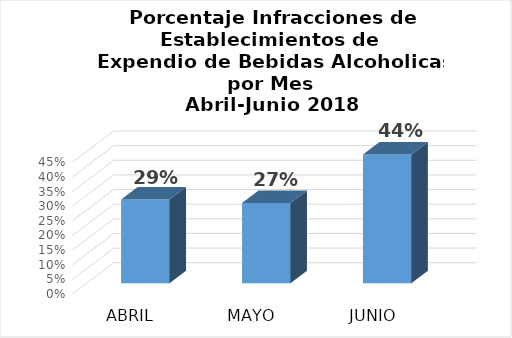
| Category | Series 0 |
|---|---|
| ABRIL | 0.286 |
| MAYO | 0.274 |
| JUNIO | 0.44 |